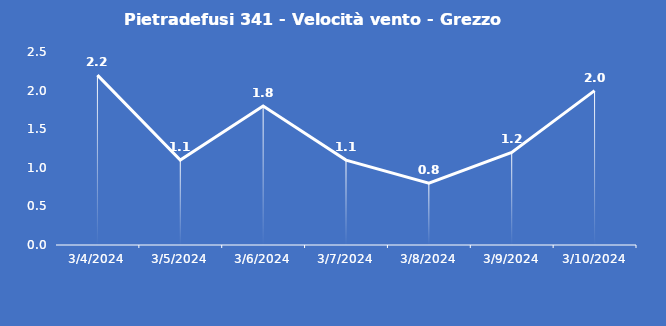
| Category | Pietradefusi 341 - Velocità vento - Grezzo (m/s) |
|---|---|
| 3/4/24 | 2.2 |
| 3/5/24 | 1.1 |
| 3/6/24 | 1.8 |
| 3/7/24 | 1.1 |
| 3/8/24 | 0.8 |
| 3/9/24 | 1.2 |
| 3/10/24 | 2 |